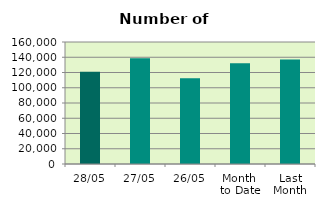
| Category | Series 0 |
|---|---|
| 28/05 | 121126 |
| 27/05 | 138794 |
| 26/05 | 112474 |
| Month 
to Date | 132116.2 |
| Last
Month | 137031.8 |